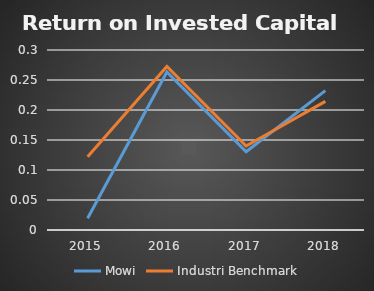
| Category | Mowi | Industri Benchmark |
|---|---|---|
| 2015.0 | 0.019 | 0.122 |
| 2016.0 | 0.263 | 0.272 |
| 2017.0 | 0.13 | 0.14 |
| 2018.0 | 0.232 | 0.214 |